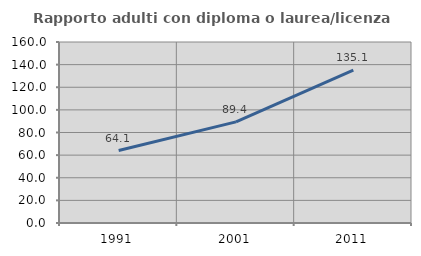
| Category | Rapporto adulti con diploma o laurea/licenza media  |
|---|---|
| 1991.0 | 64.061 |
| 2001.0 | 89.387 |
| 2011.0 | 135.088 |